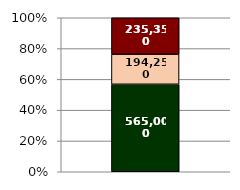
| Category | Series 0 | Series 1 | Series 2 |
|---|---|---|---|
| 0 | 565000 | 194250 | 235350 |